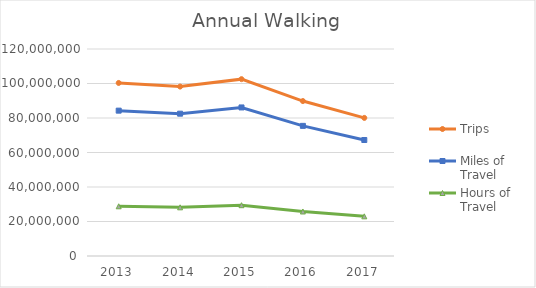
| Category | Trips | Miles of Travel | Hours of Travel |
|---|---|---|---|
| 2013 | 100319851.635 | 84265665.778 | 28818750.019 |
| 2014 | 98223914.244 | 82505141.248 | 28216652.88 |
| 2015 | 102521897.527 | 86115318.266 | 29451328.807 |
| 2016 | 89815633.84 | 75442437.957 | 25801217.379 |
| 2017 | 80056662.184 | 67245194.535 | 22997770.604 |